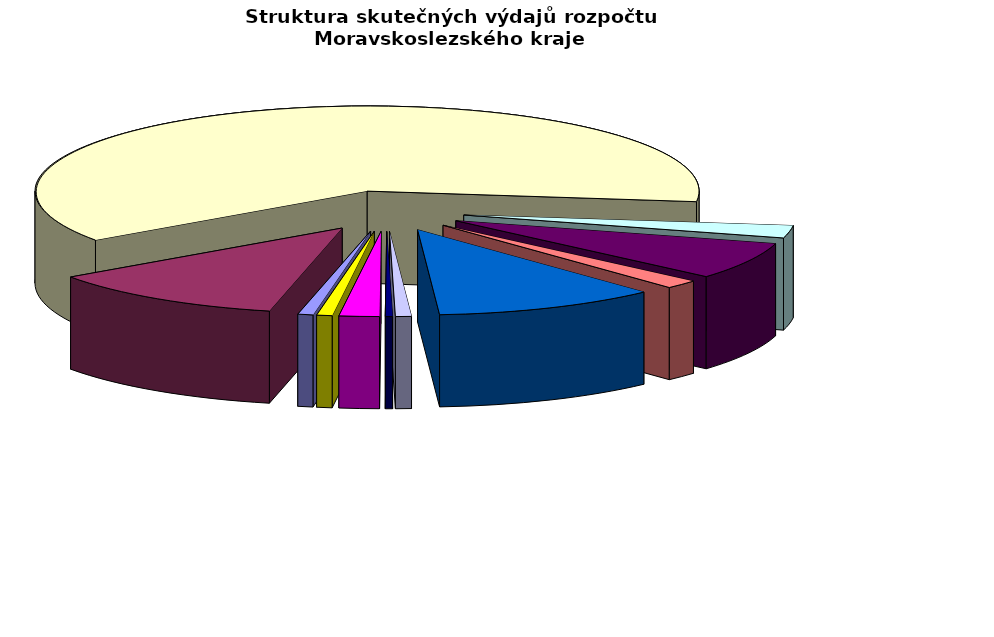
| Category | Series 0 |
|---|---|
| Regionální rozvoj | 226989.534 |
| Doprava a chytrý region | 3589743.542 |
| Školství | 18903080.661 |
| Kultura | 723281.567 |
| Zdravotnictví | 2161827.094 |
| Životní prostředí | 509416.229 |
| Sociální věci | 3330352.531 |
| Krizové řízení | 236659.609 |
| Cestovní ruch | 107537.171 |
| Všeobecná veřejná správa a služby | 599238.567 |
| Ostatní | 230563.499 |